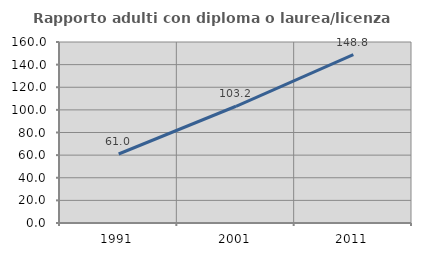
| Category | Rapporto adulti con diploma o laurea/licenza media  |
|---|---|
| 1991.0 | 60.984 |
| 2001.0 | 103.2 |
| 2011.0 | 148.807 |